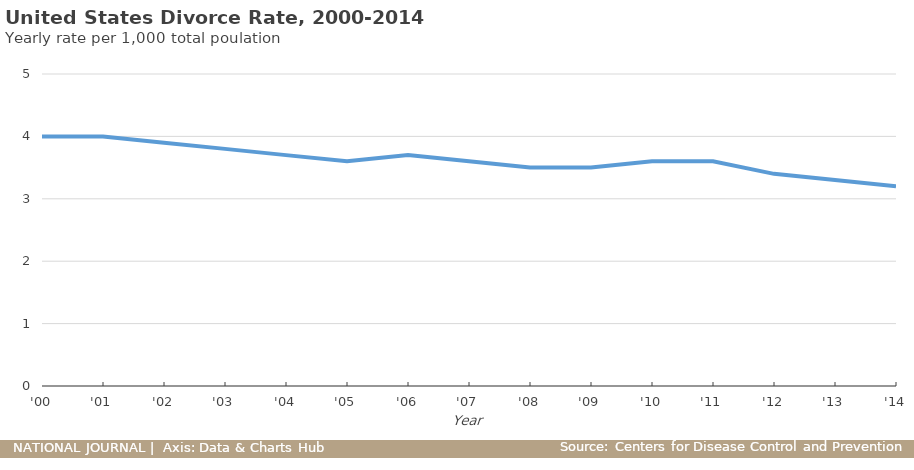
| Category | Rate per 1,000 total population |
|---|---|
| 2014-12-31 | 3.2 |
| 2013-12-31 | 3.3 |
| 2012-12-31 | 3.4 |
| 2011-12-31 | 3.6 |
| 2010-12-31 | 3.6 |
| 2009-12-31 | 3.5 |
| 2008-12-31 | 3.5 |
| 2007-12-31 | 3.6 |
| 2006-12-31 | 3.7 |
| 2005-12-31 | 3.6 |
| 2004-12-31 | 3.7 |
| 2003-12-31 | 3.8 |
| 2002-12-31 | 3.9 |
| 2001-12-31 | 4 |
| 2000-12-31 | 4 |